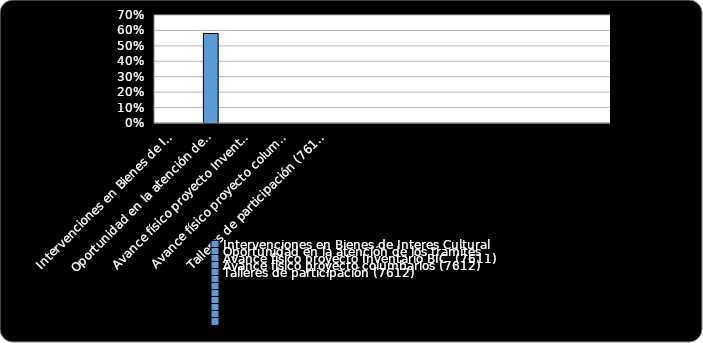
| Category | % Cumplimiento  |
|---|---|
| Intervenciones en Bienes de Interes Cultural  | 0 |
| Oportunidad en la atención de los tramites  | 0.58 |
| Avance físico proyecto Inventario BIC  (7611) | 0 |
| Avance físico proyecto columbarios (7612) | 0 |
| Talleres de participación (7612) | 0 |